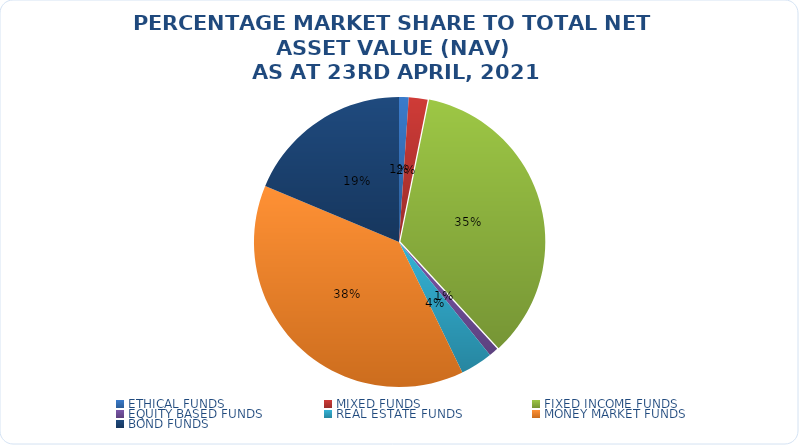
| Category | NET ASSET VALUE |
|---|---|
| ETHICAL FUNDS | 14943058143.94 |
| MIXED FUNDS | 29095842052.56 |
| FIXED INCOME FUNDS | 486223115672.343 |
| EQUITY BASED FUNDS | 14610319452.28 |
| REAL ESTATE FUNDS | 50022974148.161 |
| MONEY MARKET FUNDS | 534974149193.493 |
| BOND FUNDS | 259825348004.13 |